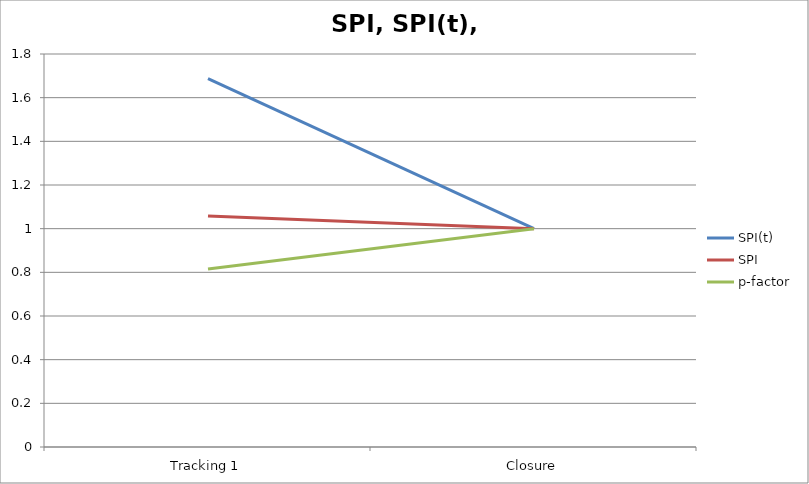
| Category | SPI(t) | SPI | p-factor |
|---|---|---|---|
| Tracking 1 | 1.688 | 1.058 | 0.816 |
| Closure | 1 | 1 | 1 |